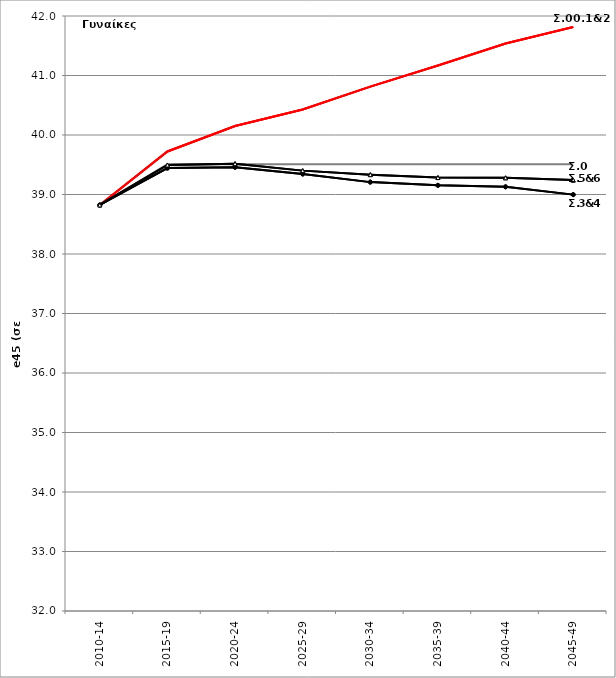
| Category | Σ0.e45 | Σ00.e45 | Σ1.e45 | Σ2.e45 | Σ3.e45 | Σ4.e45 | Σ5.e45 | Σ6.e45 |
|---|---|---|---|---|---|---|---|---|
| 2010-14 | 38.825 | 38.825 | 38.825 | 38.825 | 38.825 | 38.825 | 38.825 | 38.825 |
| 2015-19 | 39.51 | 39.723 | 39.723 | 39.723 | 39.443 | 39.443 | 39.496 | 39.496 |
| 2020-24 | 39.51 | 40.151 | 40.151 | 40.151 | 39.458 | 39.458 | 39.519 | 39.519 |
| 2025-29 | 39.51 | 40.427 | 40.427 | 40.427 | 39.345 | 39.345 | 39.401 | 39.401 |
| 2030-34 | 39.51 | 40.813 | 40.813 | 40.813 | 39.208 | 39.208 | 39.334 | 39.334 |
| 2035-39 | 39.51 | 41.169 | 41.169 | 41.169 | 39.154 | 39.154 | 39.285 | 39.285 |
| 2040-44 | 39.51 | 41.537 | 41.537 | 41.537 | 39.129 | 39.129 | 39.28 | 39.28 |
| 2045-49 | 39.51 | 41.815 | 41.815 | 41.815 | 38.998 | 38.998 | 39.242 | 39.242 |